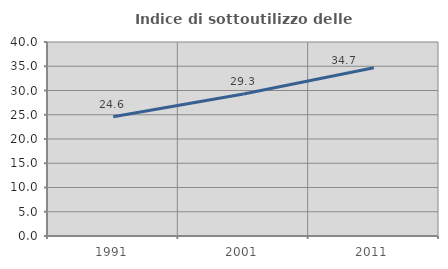
| Category | Indice di sottoutilizzo delle abitazioni  |
|---|---|
| 1991.0 | 24.597 |
| 2001.0 | 29.268 |
| 2011.0 | 34.705 |